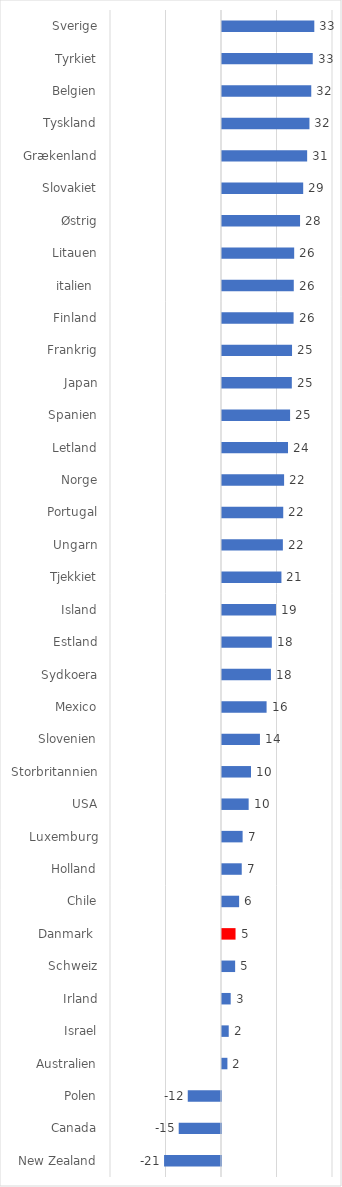
| Category | Series 0 |
|---|---|
| New Zealand | -20.513 |
| Canada | -15.241 |
| Polen | -11.977 |
| Australien | 1.95 |
| Israel | 2.425 |
| Irland | 3.132 |
| Schweiz | 4.735 |
| Danmark  | 4.878 |
| Chile | 6.168 |
| Holland | 7.113 |
| Luxemburg | 7.428 |
| USA | 9.605 |
| Storbritannien | 10.446 |
| Slovenien | 13.674 |
| Mexico | 16.067 |
| Sydkoera | 17.635 |
| Estland | 17.961 |
| Island | 19.458 |
| Tjekkiet | 21.416 |
| Ungarn | 21.936 |
| Portugal | 22.069 |
| Norge | 22.38 |
| Letland | 23.788 |
| Spanien | 24.534 |
| Japan | 25.162 |
| Frankrig | 25.239 |
| Finland | 25.797 |
| italien  | 25.868 |
| Litauen | 26.013 |
| Østrig | 28.124 |
| Slovakiet | 29.259 |
| Grækenland | 30.687 |
| Tyskland | 31.513 |
| Belgien | 32.167 |
| Tyrkiet | 32.702 |
| Sverige | 33.266 |